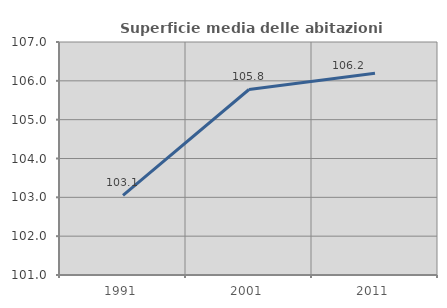
| Category | Superficie media delle abitazioni occupate |
|---|---|
| 1991.0 | 103.051 |
| 2001.0 | 105.777 |
| 2011.0 | 106.195 |